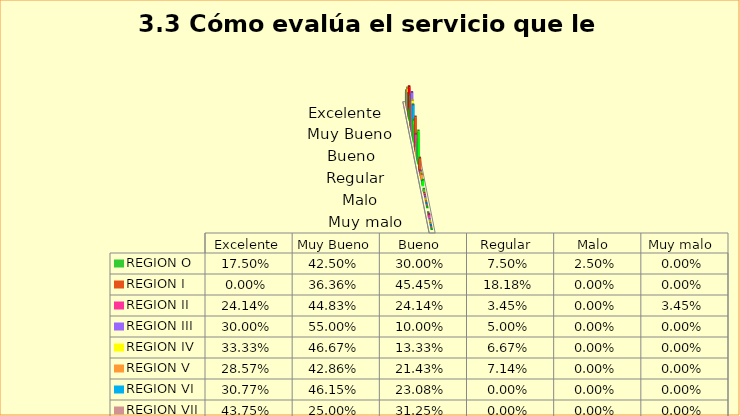
| Category | REGION O | REGION I  | REGION II | REGION III | REGION IV | REGION V  | REGION VI  | REGION VII  | REGION VIII |
|---|---|---|---|---|---|---|---|---|---|
| Excelente | 0.175 | 0 | 0.241 | 0.3 | 0.333 | 0.286 | 0.308 | 0.438 | 0.154 |
| Muy Bueno | 0.425 | 0.364 | 0.448 | 0.55 | 0.467 | 0.429 | 0.462 | 0.25 | 0.308 |
| Bueno  | 0.3 | 0.455 | 0.241 | 0.1 | 0.133 | 0.214 | 0.231 | 0.312 | 0.462 |
| Regular  | 0.075 | 0.182 | 0.034 | 0.05 | 0.067 | 0.071 | 0 | 0 | 0.077 |
| Malo  | 0.025 | 0 | 0 | 0 | 0 | 0 | 0 | 0 | 0 |
| Muy malo  | 0 | 0 | 0.034 | 0 | 0 | 0 | 0 | 0 | 0 |